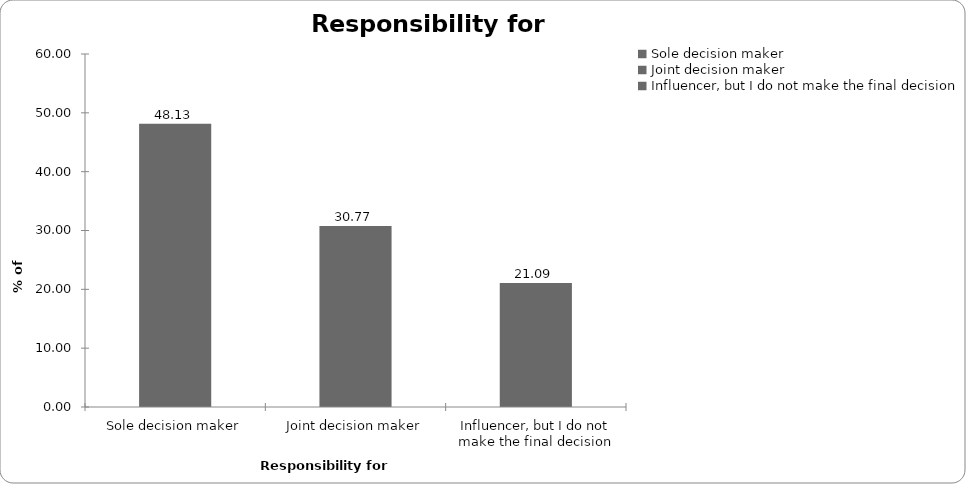
| Category | Responsibility for insurance |
|---|---|
| Sole decision maker | 48.131 |
| Joint decision maker | 30.774 |
| Influencer, but I do not make the final decision | 21.095 |